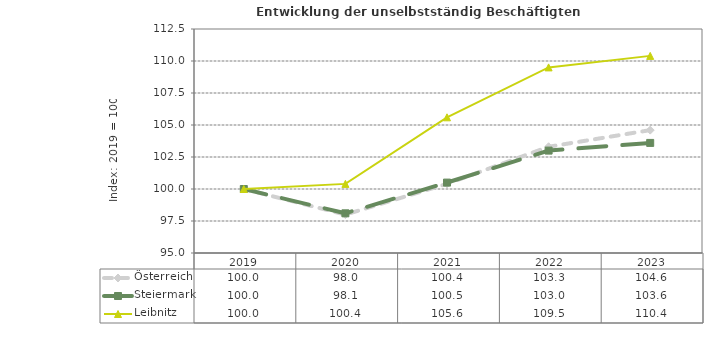
| Category | Österreich | Steiermark | Leibnitz |
|---|---|---|---|
| 2023.0 | 104.6 | 103.6 | 110.4 |
| 2022.0 | 103.3 | 103 | 109.5 |
| 2021.0 | 100.4 | 100.5 | 105.6 |
| 2020.0 | 98 | 98.1 | 100.4 |
| 2019.0 | 100 | 100 | 100 |